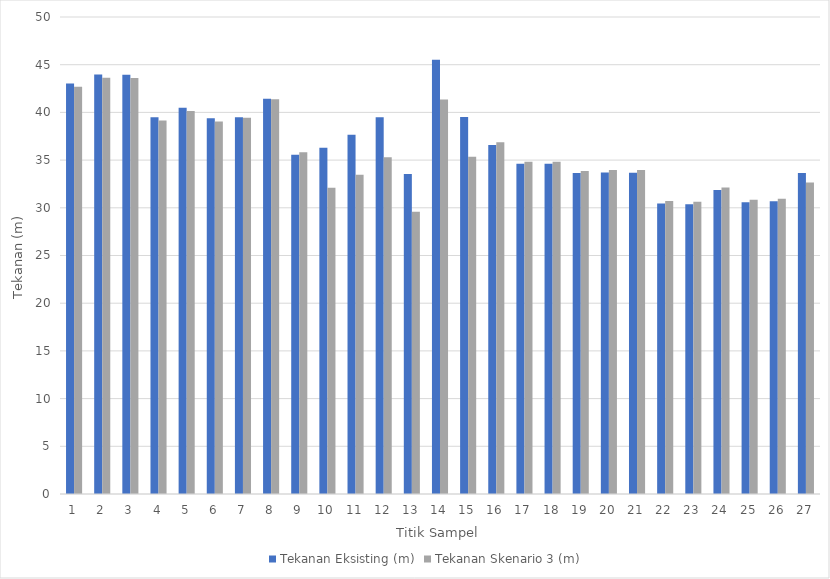
| Category | Tekanan Eksisting (m) | Tekanan Skenario 3 (m) |
|---|---|---|
| 0 | 43.02 | 42.68 |
| 1 | 43.97 | 43.63 |
| 2 | 43.94 | 43.6 |
| 3 | 39.49 | 39.15 |
| 4 | 40.49 | 40.15 |
| 5 | 39.39 | 39.05 |
| 6 | 39.48 | 39.44 |
| 7 | 41.42 | 41.38 |
| 8 | 35.56 | 35.83 |
| 9 | 36.3 | 32.09 |
| 10 | 37.67 | 33.46 |
| 11 | 39.5 | 35.29 |
| 12 | 33.55 | 29.59 |
| 13 | 45.52 | 41.34 |
| 14 | 39.53 | 35.34 |
| 15 | 36.59 | 36.88 |
| 16 | 34.62 | 34.83 |
| 17 | 34.61 | 34.82 |
| 18 | 33.64 | 33.86 |
| 19 | 33.69 | 33.96 |
| 20 | 33.68 | 33.96 |
| 21 | 30.45 | 30.71 |
| 22 | 30.38 | 30.64 |
| 23 | 31.87 | 32.14 |
| 24 | 30.59 | 30.85 |
| 25 | 30.68 | 30.95 |
| 26 | 33.64 | 32.64 |